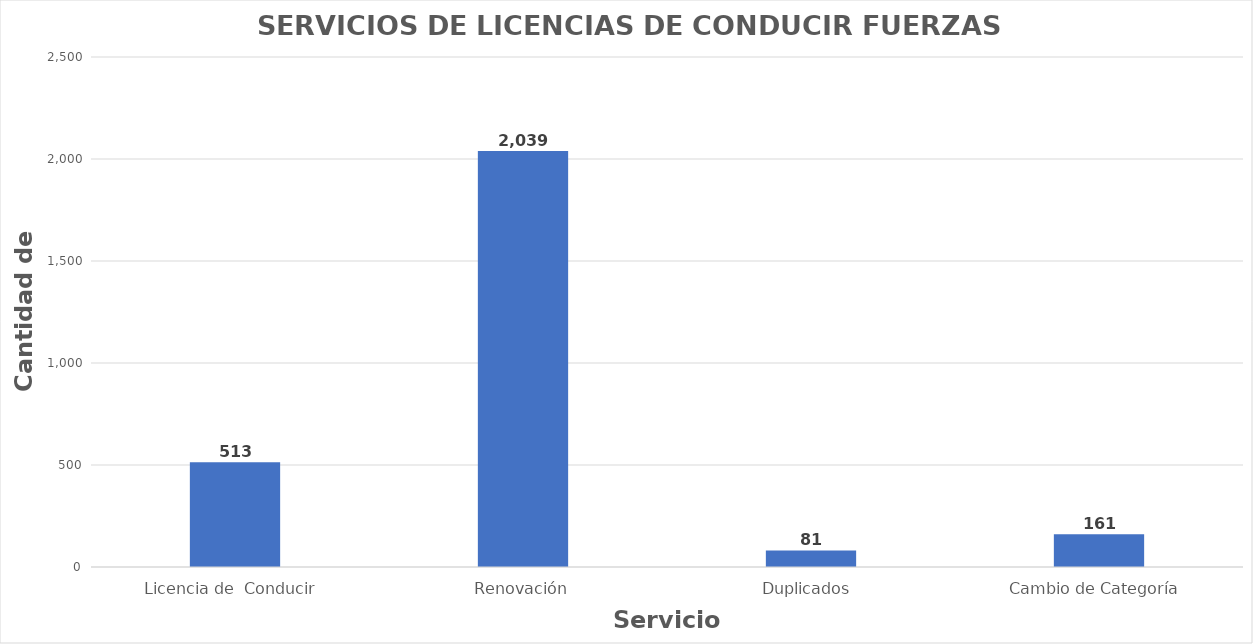
| Category | Series 0 |
|---|---|
| Licencia de  Conducir  | 513 |
| Renovación | 2039 |
| Duplicados  | 81 |
| Cambio de Categoría  | 161 |